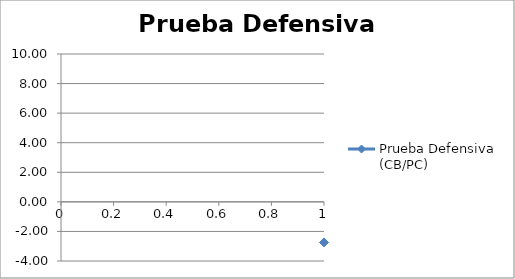
| Category | Prueba Defensiva (CB/PC) |
|---|---|
| 0 | -2.743 |
| 1 | 4.443 |
| 2 | 4.94 |
| 3 | 4.681 |
| 4 | 2.649 |
| 5 | 7.864 |
| 6 | 6.895 |
| 7 | 0.5 |